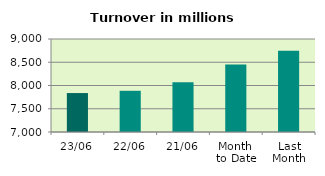
| Category | Series 0 |
|---|---|
| 23/06 | 7837.448 |
| 22/06 | 7886.403 |
| 21/06 | 8068.925 |
| Month 
to Date | 8453.757 |
| Last
Month | 8745.898 |